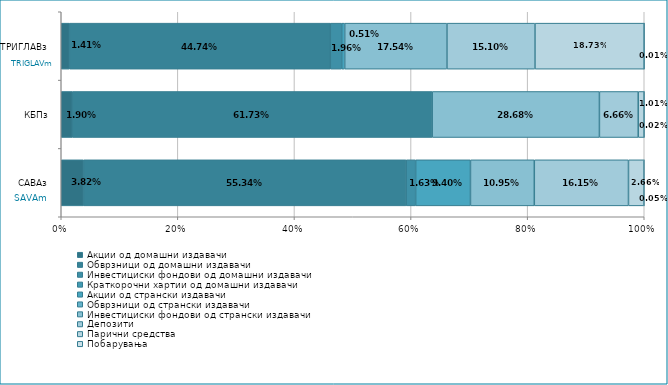
| Category | Акции од домашни издавачи  | Обврзници од домашни издавачи  | Инвестициски фондови од домашни издавачи  | Краткорочни хартии од домашни издавачи  | Акции од странски издавачи  | Обврзници од странски издавачи  | Инвестициски фондови од странски издавaчи | Депозити  | Парични средства  | Побарувања |
|---|---|---|---|---|---|---|---|---|---|---|
| САВАз | 0.038 | 0.553 | 0.016 | 0 | 0.094 | 0 | 0.11 | 0.162 | 0.027 | 0.001 |
| КБПз | 0.019 | 0.617 | 0 | 0 | 0 | 0 | 0.287 | 0.067 | 0.01 | 0 |
| ТРИГЛАВз | 0.014 | 0.447 | 0.02 | 0 | 0.005 | 0 | 0.175 | 0.151 | 0.187 | 0 |